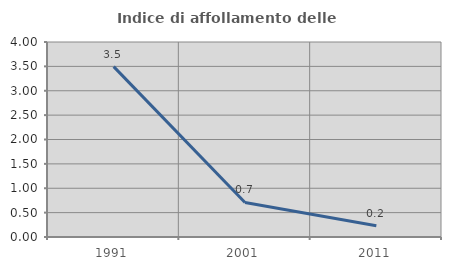
| Category | Indice di affollamento delle abitazioni  |
|---|---|
| 1991.0 | 3.495 |
| 2001.0 | 0.708 |
| 2011.0 | 0.229 |